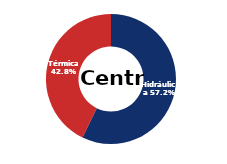
| Category | Centro |
|---|---|
| Eólica | 0 |
| Hidráulica | 2233.927 |
| Solar | 0.006 |
| Térmica | 1669.578 |